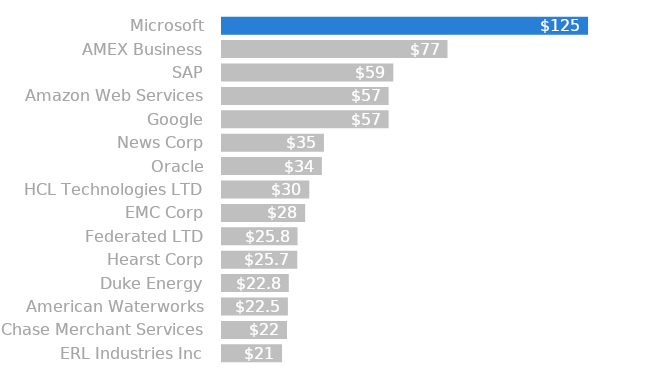
| Category | Series 0 |
|---|---|
| ERL Industries Inc | 20.5 |
| Chase Merchant Services | 22.2 |
| American Waterworks | 22.5 |
| Duke Energy | 22.8 |
| Hearst Corp | 25.7 |
| Federated LTD | 25.8 |
| EMC Corp | 28.4 |
| HCL Technologies LTD | 29.8 |
| Oracle | 34.1 |
| News Corp | 34.8 |
| Google | 56.9 |
| Amazon Web Services | 56.9 |
| SAP | 58.5 |
| AMEX Business | 77 |
| Microsoft | 125 |